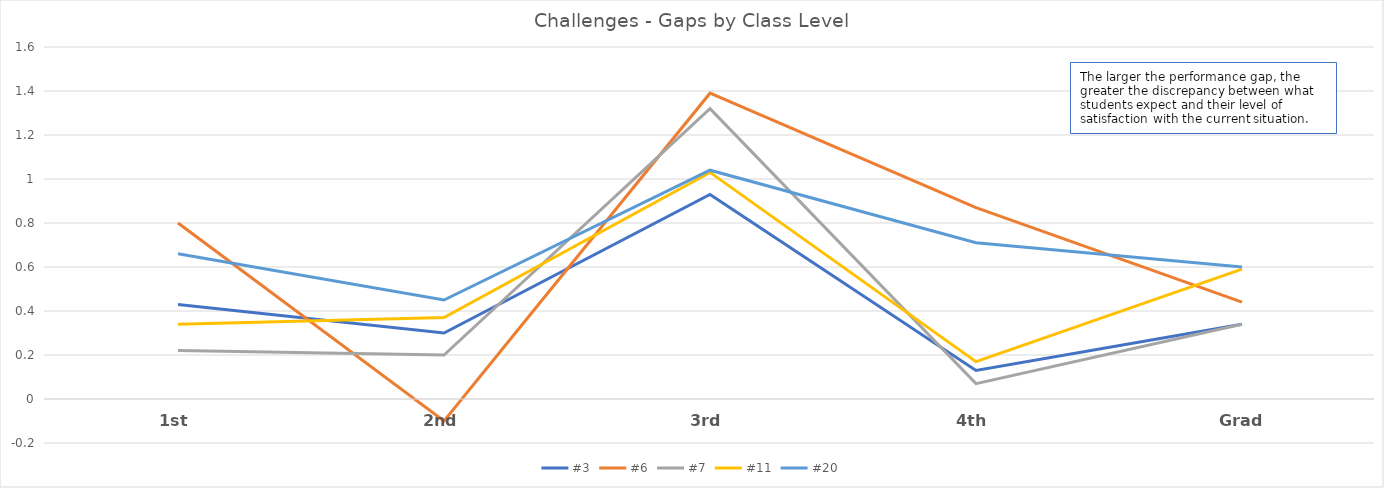
| Category | #3 | #6 | #7 | #11 | #20 |
|---|---|---|---|---|---|
| 1st | 0.43 | 0.8 | 0.22 | 0.34 | 0.66 |
| 2nd | 0.3 | -0.1 | 0.2 | 0.37 | 0.45 |
| 3rd | 0.93 | 1.39 | 1.32 | 1.03 | 1.04 |
| 4th | 0.13 | 0.87 | 0.07 | 0.17 | 0.71 |
| Grad | 0.34 | 0.44 | 0.34 | 0.59 | 0.6 |